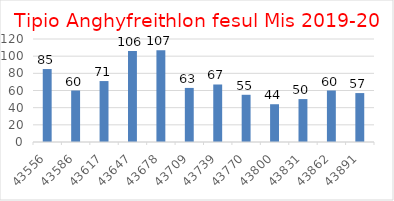
| Category | Series 0 |
|---|---|
| 43556.0 | 85 |
| 43586.0 | 60 |
| 43617.0 | 71 |
| 43647.0 | 106 |
| 43678.0 | 107 |
| 43709.0 | 63 |
| 43739.0 | 67 |
| 43770.0 | 55 |
| 43800.0 | 44 |
| 43831.0 | 50 |
| 43862.0 | 60 |
| 43891.0 | 57 |